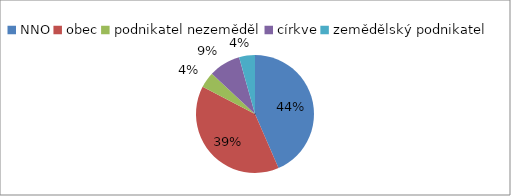
| Category | výzva 2010/2/ |
|---|---|
| NNO | 10 |
| obec | 9 |
| podnikatel nezeměděl | 1 |
| církve | 2 |
| zemědělský podnikatel | 1 |